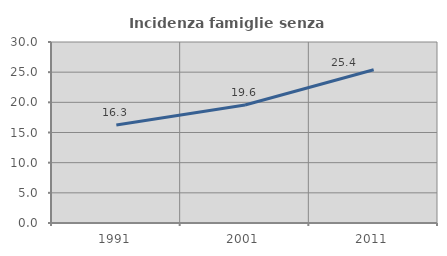
| Category | Incidenza famiglie senza nuclei |
|---|---|
| 1991.0 | 16.258 |
| 2001.0 | 19.563 |
| 2011.0 | 25.397 |